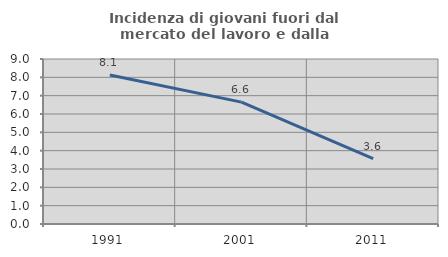
| Category | Incidenza di giovani fuori dal mercato del lavoro e dalla formazione  |
|---|---|
| 1991.0 | 8.132 |
| 2001.0 | 6.649 |
| 2011.0 | 3.571 |